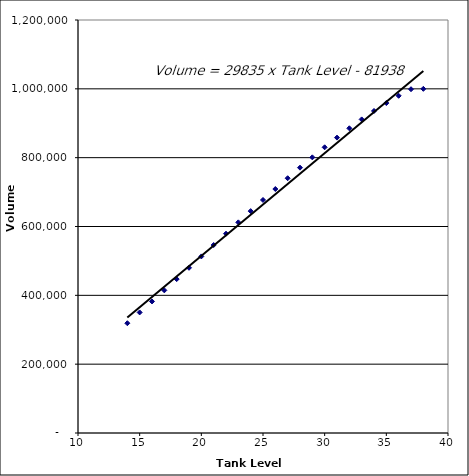
| Category | Volume
(gal) |
|---|---|
| 38.0 | 1000000 |
| 37.0 | 998854 |
| 36.0 | 979744 |
| 35.0 | 958591 |
| 34.0 | 935672 |
| 33.0 | 911199 |
| 32.0 | 885347 |
| 31.0 | 858267 |
| 30.0 | 830096 |
| 29.0 | 800952 |
| 28.0 | 770967 |
| 27.0 | 740244 |
| 26.0 | 708889 |
| 25.0 | 677005 |
| 24.0 | 644691 |
| 23.0 | 612045 |
| 22.0 | 579163 |
| 21.0 | 546139 |
| 20.0 | 513068 |
| 19.0 | 480044 |
| 18.0 | 447162 |
| 17.0 | 414516 |
| 16.0 | 382202 |
| 15.0 | 350318 |
| 14.0 | 318963 |